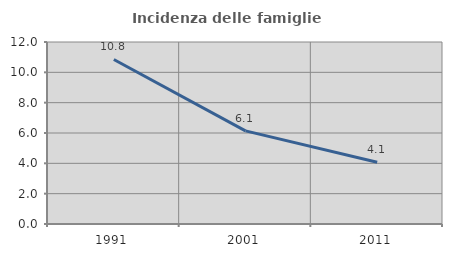
| Category | Incidenza delle famiglie numerose |
|---|---|
| 1991.0 | 10.849 |
| 2001.0 | 6.143 |
| 2011.0 | 4.07 |